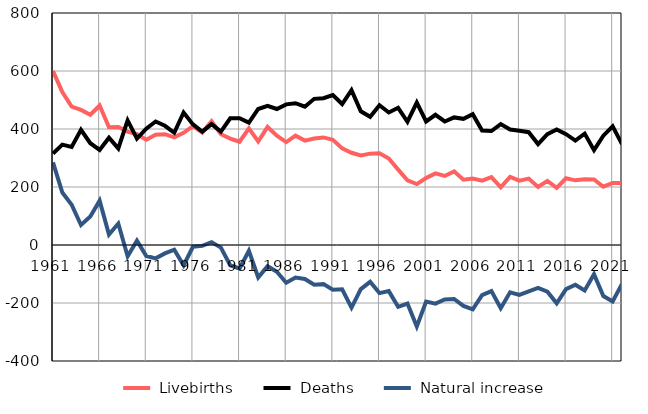
| Category |  Livebirths |  Deaths |  Natural increase |
|---|---|---|---|
| 1961.0 | 600 | 315 | 285 |
| 1962.0 | 527 | 346 | 181 |
| 1963.0 | 477 | 338 | 139 |
| 1964.0 | 466 | 397 | 69 |
| 1965.0 | 449 | 351 | 98 |
| 1966.0 | 481 | 328 | 153 |
| 1967.0 | 406 | 370 | 36 |
| 1968.0 | 407 | 333 | 74 |
| 1969.0 | 391 | 430 | -39 |
| 1970.0 | 382 | 367 | 15 |
| 1971.0 | 363 | 401 | -38 |
| 1972.0 | 380 | 426 | -46 |
| 1973.0 | 382 | 411 | -29 |
| 1974.0 | 371 | 387 | -16 |
| 1975.0 | 387 | 457 | -70 |
| 1976.0 | 410 | 416 | -6 |
| 1977.0 | 388 | 391 | -3 |
| 1978.0 | 427 | 417 | 10 |
| 1979.0 | 382 | 391 | -9 |
| 1980.0 | 367 | 437 | -70 |
| 1981.0 | 356 | 437 | -81 |
| 1982.0 | 402 | 422 | -20 |
| 1983.0 | 357 | 469 | -112 |
| 1984.0 | 407 | 480 | -73 |
| 1985.0 | 377 | 469 | -92 |
| 1986.0 | 355 | 485 | -130 |
| 1987.0 | 377 | 489 | -112 |
| 1988.0 | 360 | 477 | -117 |
| 1989.0 | 367 | 504 | -137 |
| 1990.0 | 371 | 506 | -135 |
| 1991.0 | 363 | 517 | -154 |
| 1992.0 | 333 | 486 | -153 |
| 1993.0 | 318 | 534 | -216 |
| 1994.0 | 309 | 461 | -152 |
| 1995.0 | 315 | 442 | -127 |
| 1996.0 | 316 | 482 | -166 |
| 1997.0 | 298 | 457 | -159 |
| 1998.0 | 260 | 473 | -213 |
| 1999.0 | 223 | 425 | -202 |
| 2000.0 | 210 | 491 | -281 |
| 2001.0 | 231 | 426 | -195 |
| 2002.0 | 247 | 449 | -202 |
| 2003.0 | 238 | 426 | -188 |
| 2004.0 | 254 | 440 | -186 |
| 2005.0 | 225 | 435 | -210 |
| 2006.0 | 229 | 451 | -222 |
| 2007.0 | 222 | 395 | -173 |
| 2008.0 | 234 | 393 | -159 |
| 2009.0 | 199 | 417 | -218 |
| 2010.0 | 235 | 398 | -163 |
| 2011.0 | 222 | 394 | -172 |
| 2012.0 | 229 | 389 | -160 |
| 2013.0 | 200 | 348 | -148 |
| 2014.0 | 221 | 382 | -161 |
| 2015.0 | 197 | 398 | -201 |
| 2016.0 | 230 | 382 | -152 |
| 2017.0 | 223 | 360 | -137 |
| 2018.0 | 227 | 384 | -157 |
| 2019.0 | 226 | 327 | -101 |
| 2020.0 | 201 | 377 | -176 |
| 2021.0 | 214 | 409 | -195 |
| 2022.0 | 214 | 348 | -134 |